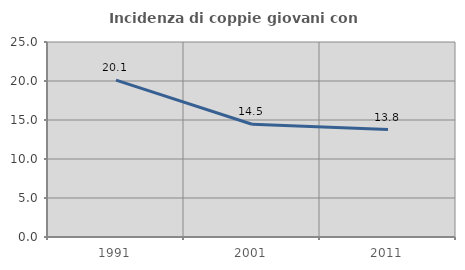
| Category | Incidenza di coppie giovani con figli |
|---|---|
| 1991.0 | 20.106 |
| 2001.0 | 14.462 |
| 2011.0 | 13.774 |